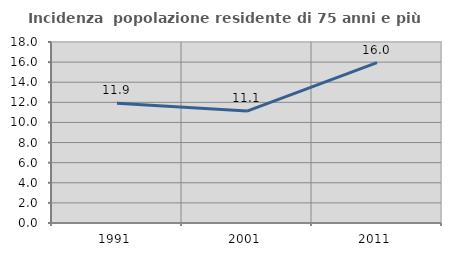
| Category | Incidenza  popolazione residente di 75 anni e più |
|---|---|
| 1991.0 | 11.917 |
| 2001.0 | 11.133 |
| 2011.0 | 15.952 |